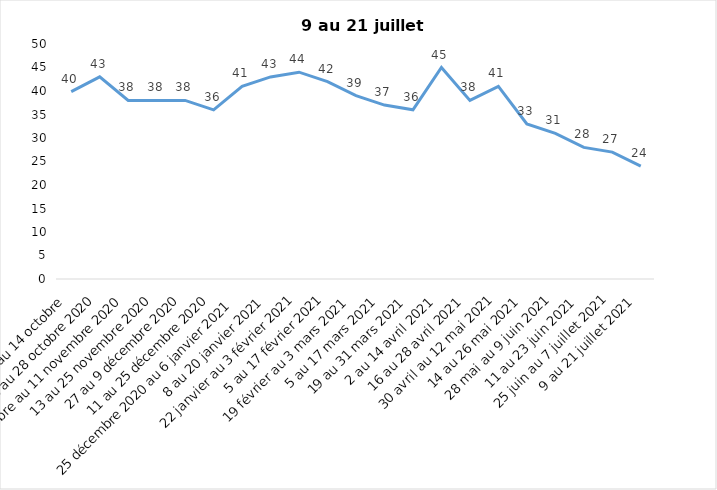
| Category | Toujours aux trois mesures |
|---|---|
| 2 au 14 octobre  | 39.85 |
| 16 au 28 octobre 2020 | 43 |
| 30 octobre au 11 novembre 2020 | 38 |
| 13 au 25 novembre 2020 | 38 |
| 27 au 9 décembre 2020 | 38 |
| 11 au 25 décembre 2020 | 36 |
| 25 décembre 2020 au 6 janvier 2021 | 41 |
| 8 au 20 janvier 2021 | 43 |
| 22 janvier au 3 février 2021 | 44 |
| 5 au 17 février 2021 | 42 |
| 19 février au 3 mars 2021 | 39 |
| 5 au 17 mars 2021 | 37 |
| 19 au 31 mars 2021 | 36 |
| 2 au 14 avril 2021 | 45 |
| 16 au 28 avril 2021 | 38 |
| 30 avril au 12 mai 2021 | 41 |
| 14 au 26 mai 2021 | 33 |
| 28 mai au 9 juin 2021 | 31 |
| 11 au 23 juin 2021 | 28 |
| 25 juin au 7 juillet 2021 | 27 |
| 9 au 21 juillet 2021 | 24 |